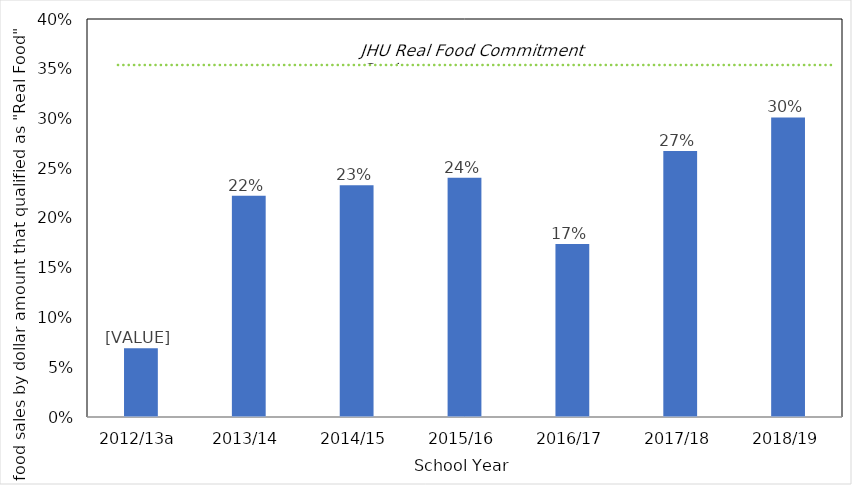
| Category | Real Food Percentage |
|---|---|
| 2012/13a | 0.069 |
| 2013/14 | 0.222 |
| 2014/15 | 0.233 |
| 2015/16 | 0.24 |
| 2016/17 | 0.174 |
| 2017/18 | 0.267 |
| 2018/19 | 0.301 |